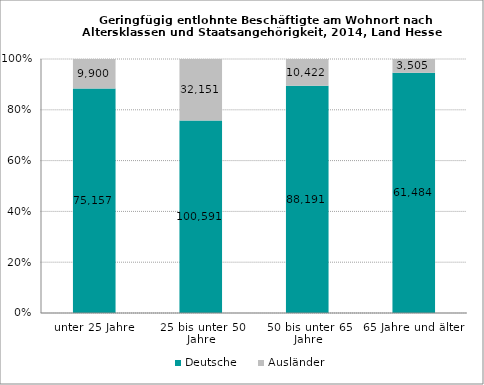
| Category | Deutsche | Ausländer |
|---|---|---|
| unter 25 Jahre | 75157 | 9900 |
| 25 bis unter 50 Jahre | 100591 | 32151 |
| 50 bis unter 65 Jahre | 88191 | 10422 |
| 65 Jahre und älter | 61484 | 3505 |